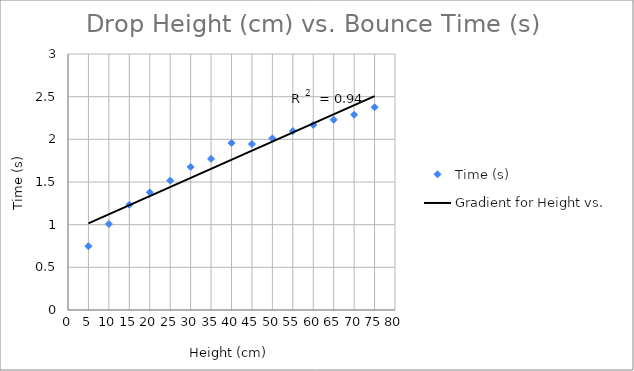
| Category | Time (s) |
|---|---|
| 5.0 | 0.747 |
| 10.0 | 1.008 |
| 15.0 | 1.233 |
| 20.0 | 1.379 |
| 25.0 | 1.517 |
| 30.0 | 1.677 |
| 35.0 | 1.771 |
| 40.0 | 1.956 |
| 45.0 | 1.945 |
| 50.0 | 2.011 |
| 55.0 | 2.097 |
| 60.0 | 2.169 |
| 65.0 | 2.23 |
| 70.0 | 2.288 |
| 75.0 | 2.376 |